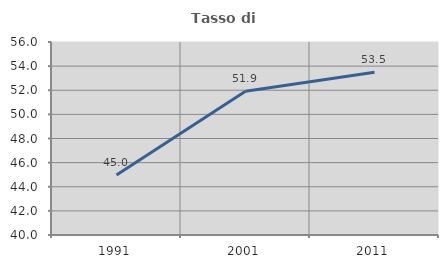
| Category | Tasso di occupazione   |
|---|---|
| 1991.0 | 44.977 |
| 2001.0 | 51.915 |
| 2011.0 | 53.484 |